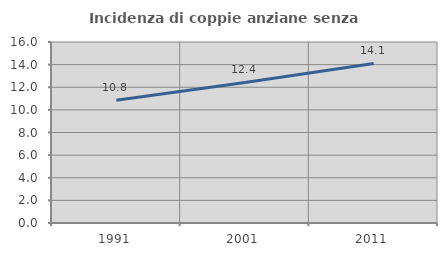
| Category | Incidenza di coppie anziane senza figli  |
|---|---|
| 1991.0 | 10.843 |
| 2001.0 | 12.427 |
| 2011.0 | 14.1 |